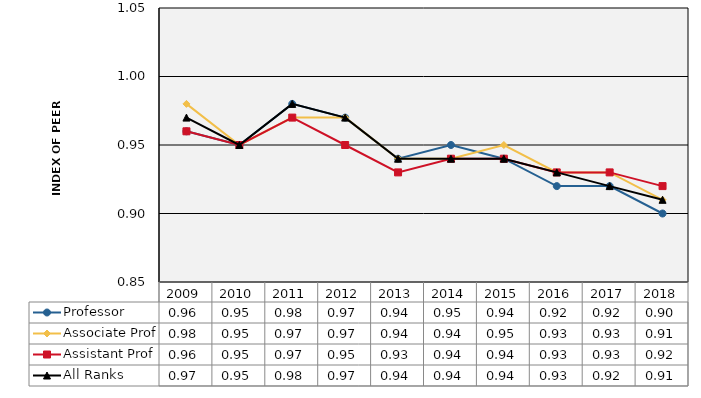
| Category | Professor | Associate Prof | Assistant Prof | All Ranks |
|---|---|---|---|---|
| 2009.0 | 0.96 | 0.98 | 0.96 | 0.97 |
| 2010.0 | 0.95 | 0.95 | 0.95 | 0.95 |
| 2011.0 | 0.98 | 0.97 | 0.97 | 0.98 |
| 2012.0 | 0.97 | 0.97 | 0.95 | 0.97 |
| 2013.0 | 0.94 | 0.94 | 0.93 | 0.94 |
| 2014.0 | 0.95 | 0.94 | 0.94 | 0.94 |
| 2015.0 | 0.94 | 0.95 | 0.94 | 0.94 |
| 2016.0 | 0.92 | 0.93 | 0.93 | 0.93 |
| 2017.0 | 0.92 | 0.93 | 0.93 | 0.92 |
| 2018.0 | 0.9 | 0.91 | 0.92 | 0.91 |